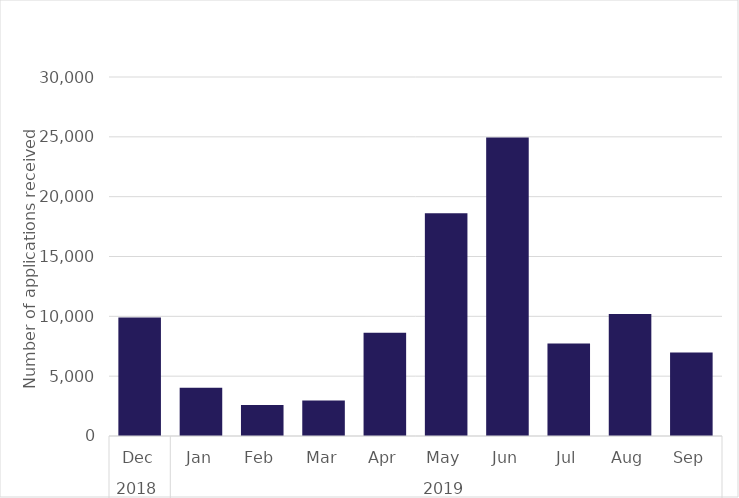
| Category | Series 0 |
|---|---|
| 0 | 9900 |
| 1 | 4025 |
| 2 | 2585 |
| 3 | 2965 |
| 4 | 8625 |
| 5 | 18605 |
| 6 | 24935 |
| 7 | 7730 |
| 8 | 10185 |
| 9 | 6980 |